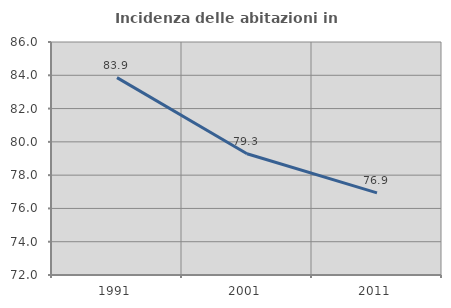
| Category | Incidenza delle abitazioni in proprietà  |
|---|---|
| 1991.0 | 83.858 |
| 2001.0 | 79.286 |
| 2011.0 | 76.935 |